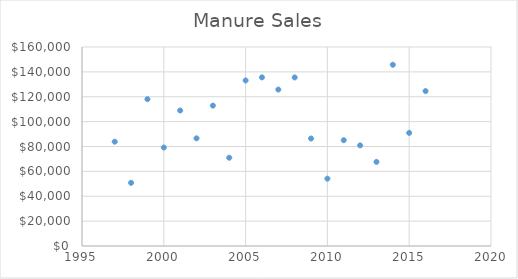
| Category | Manure Sales |
|---|---|
| 1997.0 | 83860.83 |
| 1998.0 | 50778.2 |
| 1999.0 | 118074.19 |
| 2000.0 | 79165.5 |
| 2001.0 | 108954.51 |
| 2002.0 | 86576.93 |
| 2003.0 | 112869 |
| 2004.0 | 70976.74 |
| 2005.0 | 133104.93 |
| 2006.0 | 135591.44 |
| 2007.0 | 125775.39 |
| 2008.0 | 135523.28 |
| 2009.0 | 86424.54 |
| 2010.0 | 54149.4 |
| 2011.0 | 85058.54 |
| 2012.0 | 80891.21 |
| 2013.0 | 67624.5 |
| 2014.0 | 145719.09 |
| 2015.0 | 90943.25 |
| 2016.0 | 124545.34 |